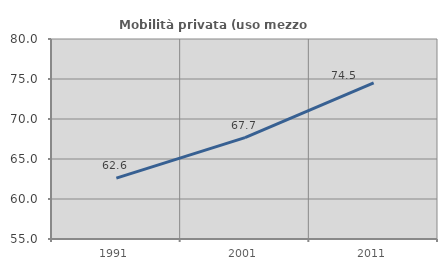
| Category | Mobilità privata (uso mezzo privato) |
|---|---|
| 1991.0 | 62.612 |
| 2001.0 | 67.668 |
| 2011.0 | 74.524 |